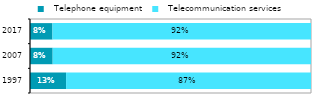
| Category |   Telephone equipment |   Telecommunication services |
|---|---|---|
| 1997.0 | 0.128 | 0.872 |
| 2007.0 | 0.081 | 0.919 |
| 2017.0 | 0.08 | 0.92 |